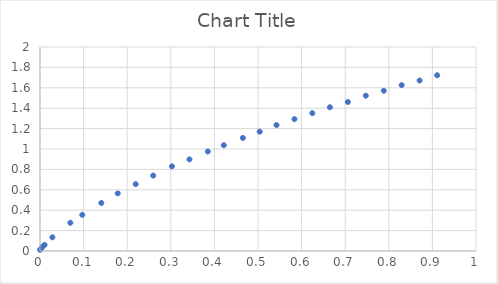
| Category | Series 0 |
|---|---|
| 0.000210199898021817 | 0.011 |
| 0.00277699733261185 | 0.024 |
| 0.0053424073091291 | 0.04 |
| 0.0104787770944546 | 0.06 |
| 0.0284532964269485 | 0.134 |
| 0.0695498045418439 | 0.277 |
| 0.0969548763948289 | 0.354 |
| 0.140634831441187 | 0.471 |
| 0.178322355071332 | 0.565 |
| 0.219441062515392 | 0.655 |
| 0.259705095786636 | 0.739 |
| 0.302538701408616 | 0.83 |
| 0.342809671970225 | 0.898 |
| 0.384791378335535 | 0.976 |
| 0.421635327457448 | 1.037 |
| 0.465334706916825 | 1.108 |
| 0.503893554216658 | 1.17 |
| 0.542451014058418 | 1.235 |
| 0.583583596083205 | 1.293 |
| 0.624716178107992 | 1.351 |
| 0.664991311043819 | 1.409 |
| 0.706126667984751 | 1.461 |
| 0.747257862551466 | 1.523 |
| 0.788394606950471 | 1.571 |
| 0.82952857643333 | 1.626 |
| 0.870666708290408 | 1.672 |
| 0.910944616142381 | 1.723 |